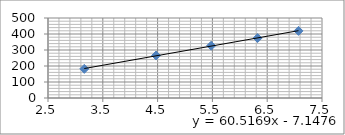
| Category | Series 0 |
|---|---|
| 3.1622776601683795 | 182 |
| 4.47213595499958 | 265.6 |
| 5.477225575051661 | 326.8 |
| 6.324555320336759 | 374.6 |
| 7.0710678118654755 | 419.4 |